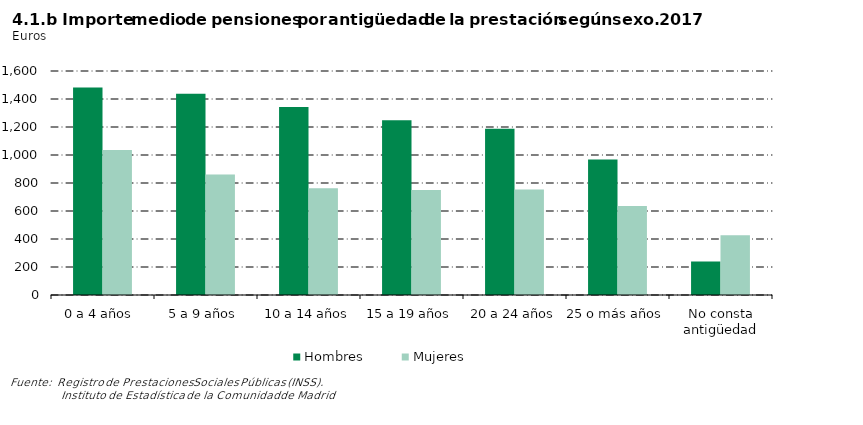
| Category | Hombres | Mujeres |
|---|---|---|
| 0 a 4 años  | 1482.619 | 1035.791 |
| 5 a 9 años | 1438.223 | 860.613 |
| 10 a 14 años | 1343.48 | 762.867 |
| 15 a 19 años | 1247.811 | 750.601 |
| 20 a 24 años | 1187.669 | 753.471 |
| 25 o más años | 966.99 | 636.269 |
| No consta antigüedad | 240.021 | 426.178 |